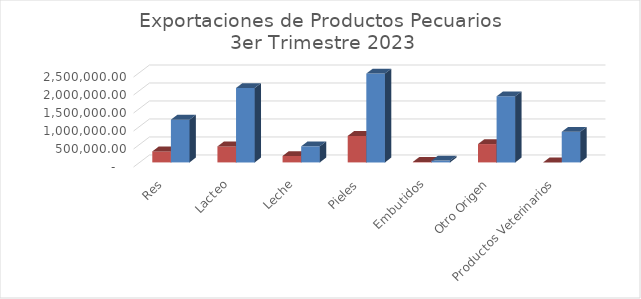
| Category | Kilos | Valor US$ |
|---|---|---|
| Res | 305573.26 | 1187480.2 |
| Lacteo | 443822.52 | 2068897.18 |
| Leche | 179535.18 | 447240.74 |
| Pieles | 736439.47 | 2469245.25 |
| Embutidos | 13607.78 | 50432.4 |
| Otro Origen | 509961.03 | 1836921.95 |
| Productos Veterinarios | 0 | 851134.32 |